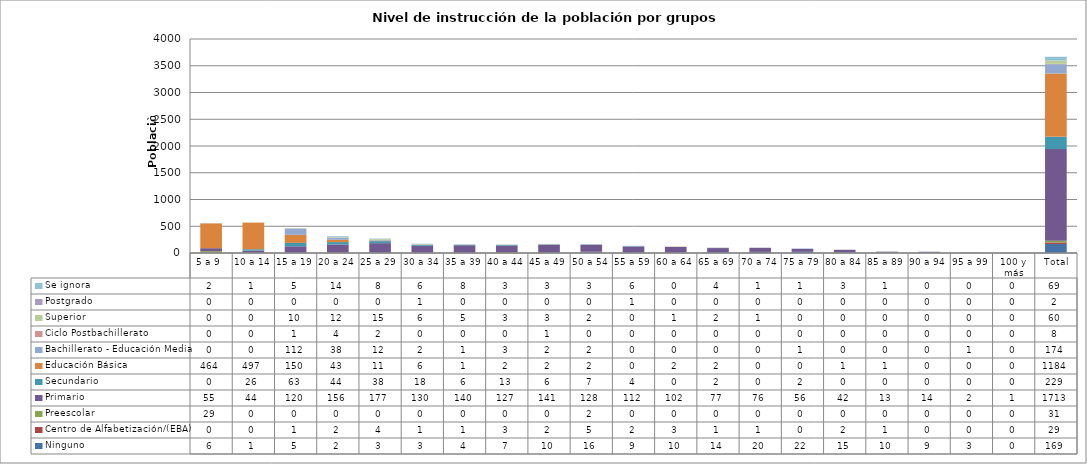
| Category | Ninguno | Centro de Alfabetización/(EBA) | Preescolar | Primario | Secundario | Educación Básica | Bachillerato - Educación Media | Ciclo Postbachillerato | Superior | Postgrado | Se ignora |
|---|---|---|---|---|---|---|---|---|---|---|---|
| 5 a 9  | 6 | 0 | 29 | 55 | 0 | 464 | 0 | 0 | 0 | 0 | 2 |
| 10 a 14  | 1 | 0 | 0 | 44 | 26 | 497 | 0 | 0 | 0 | 0 | 1 |
| 15 a 19  | 5 | 1 | 0 | 120 | 63 | 150 | 112 | 1 | 10 | 0 | 5 |
| 20 a 24  | 2 | 2 | 0 | 156 | 44 | 43 | 38 | 4 | 12 | 0 | 14 |
| 25 a 29 | 3 | 4 | 0 | 177 | 38 | 11 | 12 | 2 | 15 | 0 | 8 |
| 30 a 34 | 3 | 1 | 0 | 130 | 18 | 6 | 2 | 0 | 6 | 1 | 6 |
| 35 a 39 | 4 | 1 | 0 | 140 | 6 | 1 | 1 | 0 | 5 | 0 | 8 |
| 40 a 44 | 7 | 3 | 0 | 127 | 13 | 2 | 3 | 0 | 3 | 0 | 3 |
| 45 a 49 | 10 | 2 | 0 | 141 | 6 | 2 | 2 | 1 | 3 | 0 | 3 |
| 50 a 54 | 16 | 5 | 2 | 128 | 7 | 2 | 2 | 0 | 2 | 0 | 3 |
| 55 a 59 | 9 | 2 | 0 | 112 | 4 | 0 | 0 | 0 | 0 | 1 | 6 |
| 60 a 64 | 10 | 3 | 0 | 102 | 0 | 2 | 0 | 0 | 1 | 0 | 0 |
| 65 a 69 | 14 | 1 | 0 | 77 | 2 | 2 | 0 | 0 | 2 | 0 | 4 |
| 70 a 74 | 20 | 1 | 0 | 76 | 0 | 0 | 0 | 0 | 1 | 0 | 1 |
| 75 a 79 | 22 | 0 | 0 | 56 | 2 | 0 | 1 | 0 | 0 | 0 | 1 |
| 80 a 84 | 15 | 2 | 0 | 42 | 0 | 1 | 0 | 0 | 0 | 0 | 3 |
| 85 a 89 | 10 | 1 | 0 | 13 | 0 | 1 | 0 | 0 | 0 | 0 | 1 |
| 90 a 94 | 9 | 0 | 0 | 14 | 0 | 0 | 0 | 0 | 0 | 0 | 0 |
| 95 a 99 | 3 | 0 | 0 | 2 | 0 | 0 | 1 | 0 | 0 | 0 | 0 |
| 100 y más | 0 | 0 | 0 | 1 | 0 | 0 | 0 | 0 | 0 | 0 | 0 |
|  Total | 169 | 29 | 31 | 1713 | 229 | 1184 | 174 | 8 | 60 | 2 | 69 |